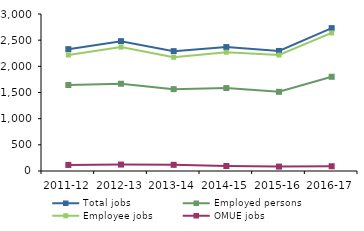
| Category | Total jobs | Employed persons | Employee jobs | OMUE jobs |
|---|---|---|---|---|
| 2011-12 | 2328 | 1643 | 2216 | 116 |
| 2012-13 | 2481 | 1667 | 2367 | 123 |
| 2013-14 | 2290 | 1564 | 2173 | 118 |
| 2014-15 | 2368 | 1585 | 2269 | 96 |
| 2015-16 | 2294 | 1513 | 2216 | 84 |
| 2016-17 | 2730 | 1800 | 2639 | 91 |